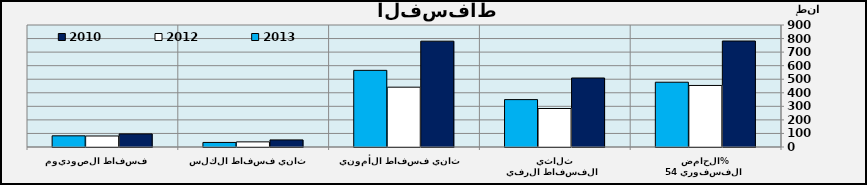
| Category | 2010 | 2012 | 2013 |
|---|---|---|---|
| الحامض الفسفوري 54% | 781.785 | 454.029 | 477.806 |
| ثلاثي الفسفاط الرفيع | 509.13 | 283.97 | 349.668 |
| ثاني فسفاط الأمونيا | 780.6 | 441.328 | 565.434 |
| ثاني فسفاط الكلس | 52.38 | 37.91 | 33.59 |
| فسفاط الصوديوم  | 96.63 | 81.18 | 82.514 |